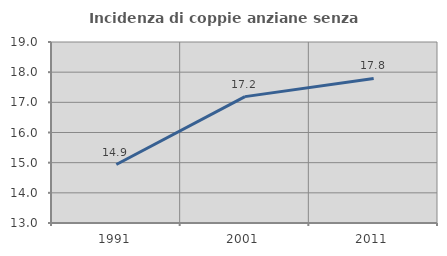
| Category | Incidenza di coppie anziane senza figli  |
|---|---|
| 1991.0 | 14.938 |
| 2001.0 | 17.189 |
| 2011.0 | 17.792 |